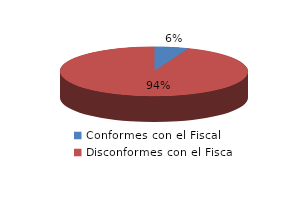
| Category | Series 0 |
|---|---|
| 0 | 1 |
| 1 | 16 |